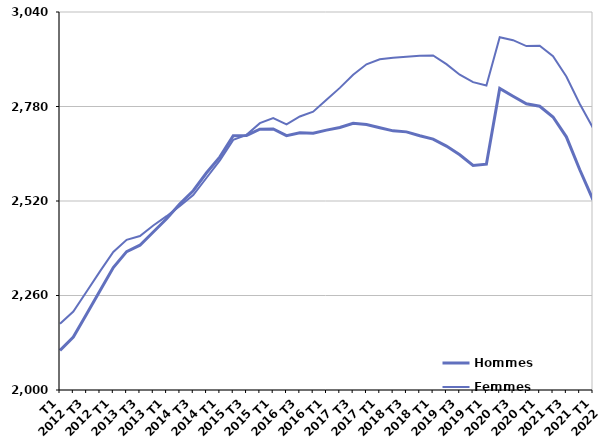
| Category | Hommes  | Femmes  |
|---|---|---|
| T1
2012 | 2108.9 | 2182.2 |
| T2
2012 | 2145.9 | 2215.7 |
| T3
2012 | 2208.9 | 2271.1 |
| T4
2012 | 2273.2 | 2326.4 |
| T1
2013 | 2336.8 | 2379.6 |
| T2
2013 | 2380.7 | 2413.3 |
| T3
2013 | 2398.4 | 2423.7 |
| T4
2013 | 2434.8 | 2452.7 |
| T1
2014 | 2471.2 | 2478.2 |
| T2
2014 | 2512.3 | 2506.5 |
| T3
2014 | 2548.3 | 2536.3 |
| T4
2014 | 2597.7 | 2584 |
| T1
2015 | 2641.3 | 2631.8 |
| T2
2015 | 2699.5 | 2688.2 |
| T3
2015 | 2700.4 | 2702.1 |
| T4
2015 | 2717.4 | 2734.1 |
| T1
2016 | 2718.3 | 2748.2 |
| T2
2016 | 2699.8 | 2731 |
| T3
2016 | 2707.6 | 2752.5 |
| T4
2016 | 2706.4 | 2765.8 |
| T1
2017 | 2715 | 2798.8 |
| T2
2017 | 2722.1 | 2831.2 |
| T3
2017 | 2733.6 | 2867.2 |
| T4
2017 | 2730.4 | 2896 |
| T1
2018 | 2721.4 | 2910.1 |
| T2
2018 | 2713 | 2913.8 |
| T3
2018 | 2710.2 | 2916.6 |
| T4
2018 | 2699.5 | 2919.5 |
| T1
2019 | 2690.2 | 2920.5 |
| T2
2019 | 2671 | 2896.6 |
| T3
2019 | 2647 | 2867.6 |
| T4
2019 | 2617.8 | 2846.9 |
| T1
2020 | 2621.2 | 2837.8 |
| T2
2020 | 2829.8 | 2970.7 |
| T3
2020 | 2808.2 | 2962.5 |
| T4
2020 | 2787.3 | 2946.3 |
| T1
2021 | 2780.6 | 2947.2 |
| T2
2021 | 2751.2 | 2918.5 |
| T3
2021 | 2696.6 | 2862.6 |
| T4
2021 | 2606.6 | 2787.7 |
| T1
2022 | 2523.3 | 2720.9 |